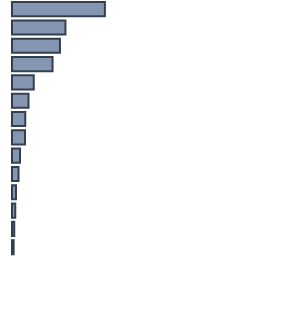
| Category | Series 0 |
|---|---|
| 0 | 33.9 |
| 1 | 19.5 |
| 2 | 17.5 |
| 3 | 14.8 |
| 4 | 7.9 |
| 5 | 6 |
| 6 | 4.8 |
| 7 | 4.7 |
| 8 | 2.9 |
| 9 | 2.4 |
| 10 | 1.5 |
| 11 | 1.2 |
| 12 | 0.8 |
| 13 | 0.6 |
| 14 | 0 |
| 15 | 0 |